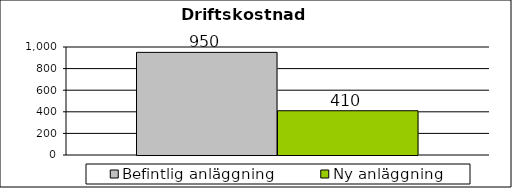
| Category | Befintlig anläggning | Ny anläggning |
|---|---|---|
| 0 | 950.268 | 409.86 |